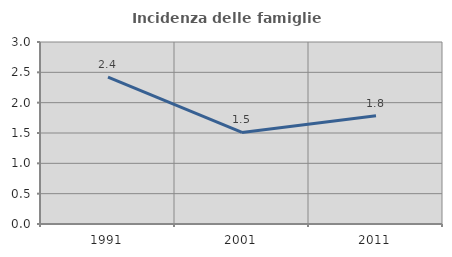
| Category | Incidenza delle famiglie numerose |
|---|---|
| 1991.0 | 2.422 |
| 2001.0 | 1.509 |
| 2011.0 | 1.785 |